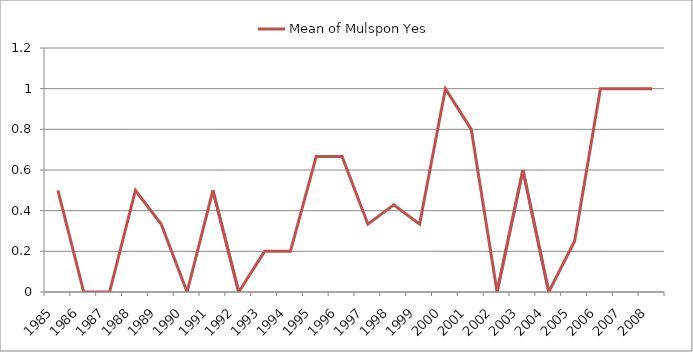
| Category | Mean of Mulspon Yes |
|---|---|
| 1985.0 | 0.5 |
| 1986.0 | 0 |
| 1987.0 | 0 |
| 1988.0 | 0.5 |
| 1989.0 | 0.333 |
| 1990.0 | 0 |
| 1991.0 | 0.5 |
| 1992.0 | 0 |
| 1993.0 | 0.2 |
| 1994.0 | 0.2 |
| 1995.0 | 0.667 |
| 1996.0 | 0.667 |
| 1997.0 | 0.333 |
| 1998.0 | 0.429 |
| 1999.0 | 0.333 |
| 2000.0 | 1 |
| 2001.0 | 0.8 |
| 2002.0 | 0 |
| 2003.0 | 0.6 |
| 2004.0 | 0 |
| 2005.0 | 0.25 |
| 2006.0 | 1 |
| 2007.0 | 1 |
| 2008.0 | 1 |